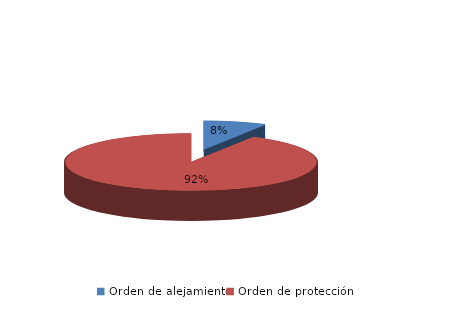
| Category | Series 0 |
|---|---|
| Orden de alejamiento | 46 |
| Orden de protección | 527 |